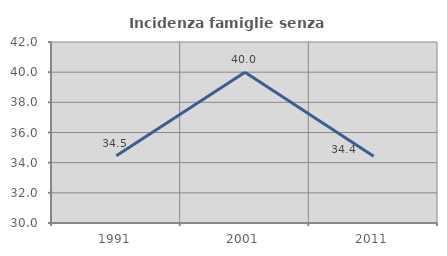
| Category | Incidenza famiglie senza nuclei |
|---|---|
| 1991.0 | 34.454 |
| 2001.0 | 40 |
| 2011.0 | 34.426 |